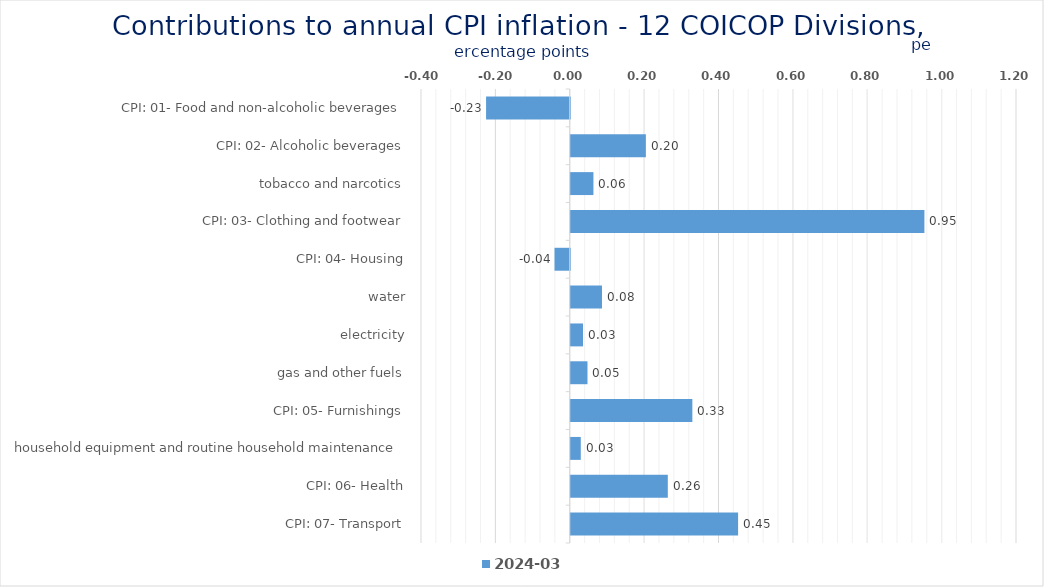
| Category | 2024-03 |
|---|---|
| CPI: 01- Food and non-alcoholic beverages | -0.225 |
| CPI: 02- Alcoholic beverages, tobacco and narcotics | 0.202 |
| CPI: 03- Clothing and footwear | 0.061 |
| CPI: 04- Housing, water, electricity, gas and other fuels | 0.951 |
| CPI: 05- Furnishings, household equipment and routine household maintenance | -0.041 |
| CPI: 06- Health | 0.084 |
| CPI: 07- Transport | 0.033 |
| CPI: 08- Communication | 0.045 |
| CPI: 09- Recreation and culture | 0.327 |
| CPI: 10- Education | 0.027 |
| CPI: 11- Restaurants and hotels | 0.261 |
| CPI: 12- Miscellaneous goods and services | 0.45 |